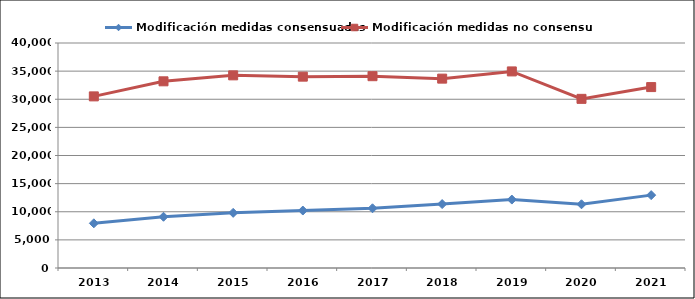
| Category | Modificación medidas consensuadas | Modificación medidas no consensuadas |
|---|---|---|
| 2013.0 | 7943 | 30511 |
| 2014.0 | 9110 | 33188 |
| 2015.0 | 9805 | 34248 |
| 2016.0 | 10214 | 34017 |
| 2017.0 | 10617 | 34099 |
| 2018.0 | 11366 | 33666 |
| 2019.0 | 12166 | 34949 |
| 2020.0 | 11329 | 30070 |
| 2021.0 | 12955 | 32162 |